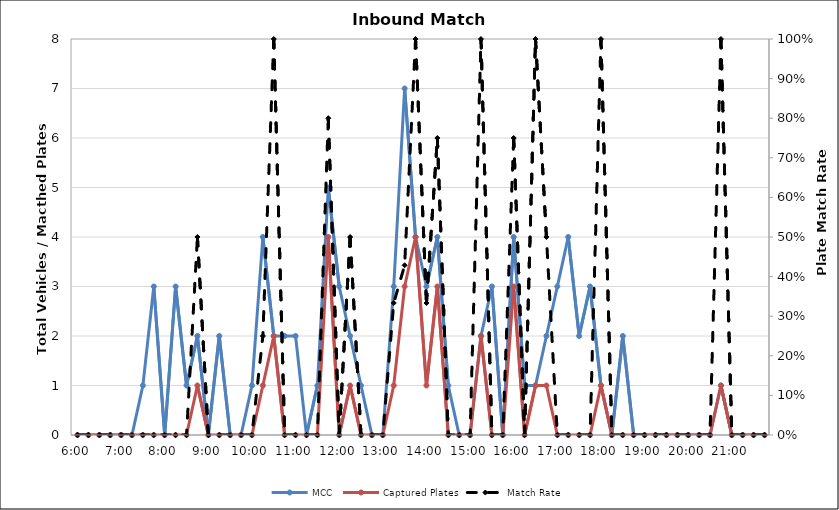
| Category | MCC | Captured Plates |
|---|---|---|
| 0.25 | 0 | 0 |
| 0.260416666666667 | 0 | 0 |
| 0.270833333333333 | 0 | 0 |
| 0.28125 | 0 | 0 |
| 0.291666666666667 | 0 | 0 |
| 0.302083333333333 | 0 | 0 |
| 0.3125 | 1 | 0 |
| 0.322916666666667 | 3 | 0 |
| 0.333333333333333 | 0 | 0 |
| 0.34375 | 3 | 0 |
| 0.354166666666667 | 1 | 0 |
| 0.364583333333333 | 2 | 1 |
| 0.375 | 0 | 0 |
| 0.385416666666667 | 2 | 0 |
| 0.395833333333333 | 0 | 0 |
| 0.40625 | 0 | 0 |
| 0.416666666666667 | 1 | 0 |
| 0.427083333333333 | 4 | 1 |
| 0.4375 | 2 | 2 |
| 0.447916666666667 | 2 | 0 |
| 0.458333333333333 | 2 | 0 |
| 0.46875 | 0 | 0 |
| 0.479166666666667 | 1 | 0 |
| 0.489583333333333 | 5 | 4 |
| 0.5 | 3 | 0 |
| 0.510416666666667 | 2 | 1 |
| 0.520833333333333 | 1 | 0 |
| 0.53125 | 0 | 0 |
| 0.541666666666667 | 0 | 0 |
| 0.552083333333333 | 3 | 1 |
| 0.5625 | 7 | 3 |
| 0.572916666666667 | 4 | 4 |
| 0.583333333333333 | 3 | 1 |
| 0.59375 | 4 | 3 |
| 0.604166666666667 | 1 | 0 |
| 0.614583333333333 | 0 | 0 |
| 0.625 | 0 | 0 |
| 0.635416666666667 | 2 | 2 |
| 0.645833333333333 | 3 | 0 |
| 0.65625 | 0 | 0 |
| 0.666666666666667 | 4 | 3 |
| 0.677083333333333 | 1 | 0 |
| 0.6875 | 1 | 1 |
| 0.697916666666667 | 2 | 1 |
| 0.708333333333333 | 3 | 0 |
| 0.71875 | 4 | 0 |
| 0.729166666666667 | 2 | 0 |
| 0.739583333333333 | 3 | 0 |
| 0.75 | 1 | 1 |
| 0.760416666666667 | 0 | 0 |
| 0.770833333333333 | 2 | 0 |
| 0.78125 | 0 | 0 |
| 0.791666666666667 | 0 | 0 |
| 0.802083333333333 | 0 | 0 |
| 0.8125 | 0 | 0 |
| 0.822916666666667 | 0 | 0 |
| 0.833333333333333 | 0 | 0 |
| 0.84375 | 0 | 0 |
| 0.854166666666667 | 0 | 0 |
| 0.864583333333333 | 1 | 1 |
| 0.875 | 0 | 0 |
| 0.885416666666667 | 0 | 0 |
| 0.895833333333333 | 0 | 0 |
| 0.90625 | 0 | 0 |